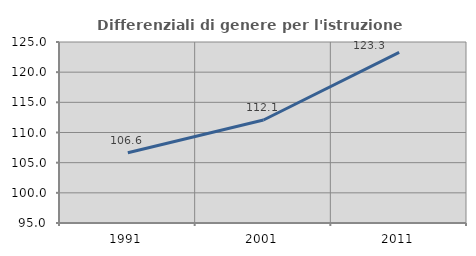
| Category | Differenziali di genere per l'istruzione superiore |
|---|---|
| 1991.0 | 106.648 |
| 2001.0 | 112.071 |
| 2011.0 | 123.271 |